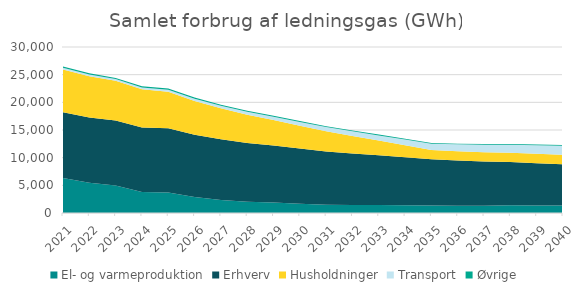
| Category | El- og varmeproduktion | Erhverv | Husholdninger | Transport | Øvrige |
|---|---|---|---|---|---|
| 2021.0 | 6304.809 | 11883.465 | 7759.028 | 286.933 | 229.648 |
| 2022.0 | 5450.854 | 11813.732 | 7467.18 | 299.21 | 225.594 |
| 2023.0 | 4958.968 | 11743.999 | 7175.332 | 317.014 | 221.539 |
| 2024.0 | 3786.859 | 11674.266 | 6883.484 | 341.614 | 217.485 |
| 2025.0 | 3721.326 | 11604.533 | 6591.636 | 370.444 | 213.431 |
| 2026.0 | 2873.263 | 11279.101 | 6099.47 | 411.553 | 205.058 |
| 2027.0 | 2358.306 | 10953.668 | 5607.304 | 461.374 | 196.686 |
| 2028.0 | 2034.94 | 10628.236 | 5115.138 | 520.994 | 188.313 |
| 2029.0 | 1883.246 | 10302.803 | 4622.972 | 589.525 | 179.941 |
| 2030.0 | 1669.44 | 9977.37 | 4130.806 | 667.596 | 171.569 |
| 2031.0 | 1472.483 | 9651.938 | 3638.641 | 756.909 | 163.196 |
| 2032.0 | 1431.96 | 9326.505 | 3146.475 | 849.539 | 154.824 |
| 2033.0 | 1426.282 | 9001.073 | 2654.309 | 944.418 | 146.451 |
| 2034.0 | 1414.495 | 8675.64 | 2162.143 | 1041.847 | 138.079 |
| 2035.0 | 1352.831 | 8350.207 | 1669.977 | 1137.952 | 129.706 |
| 2036.0 | 1316.598 | 8173.934 | 1673.462 | 1239.475 | 128.689 |
| 2037.0 | 1315.772 | 7997.661 | 1676.946 | 1340.082 | 127.672 |
| 2038.0 | 1390.89 | 7821.388 | 1680.431 | 1442.912 | 126.655 |
| 2039.0 | 1367.215 | 7645.115 | 1683.916 | 1548.106 | 125.637 |
| 2040.0 | 1351.821 | 7468.842 | 1687.4 | 1647.14 | 124.62 |